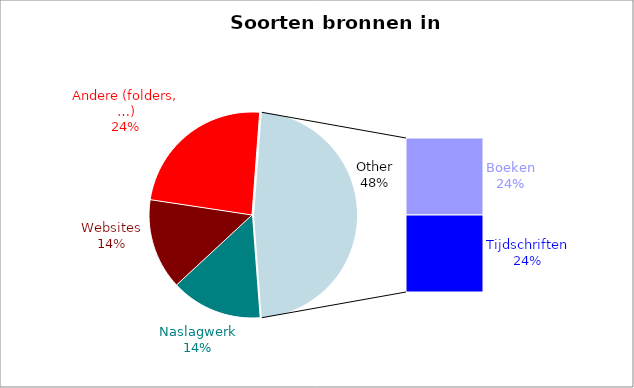
| Category | Procent |
|---|---|
| Naslagwerk | 0.143 |
| Websites | 0.143 |
| Andere (folders, …) | 0.238 |
| Boeken | 0.238 |
| Tijdschriften | 0.238 |